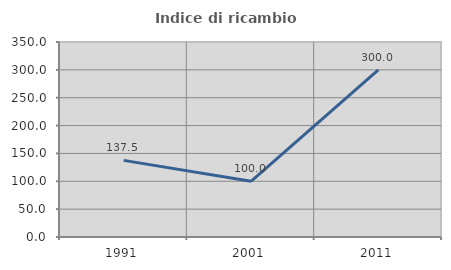
| Category | Indice di ricambio occupazionale  |
|---|---|
| 1991.0 | 137.5 |
| 2001.0 | 100 |
| 2011.0 | 300 |